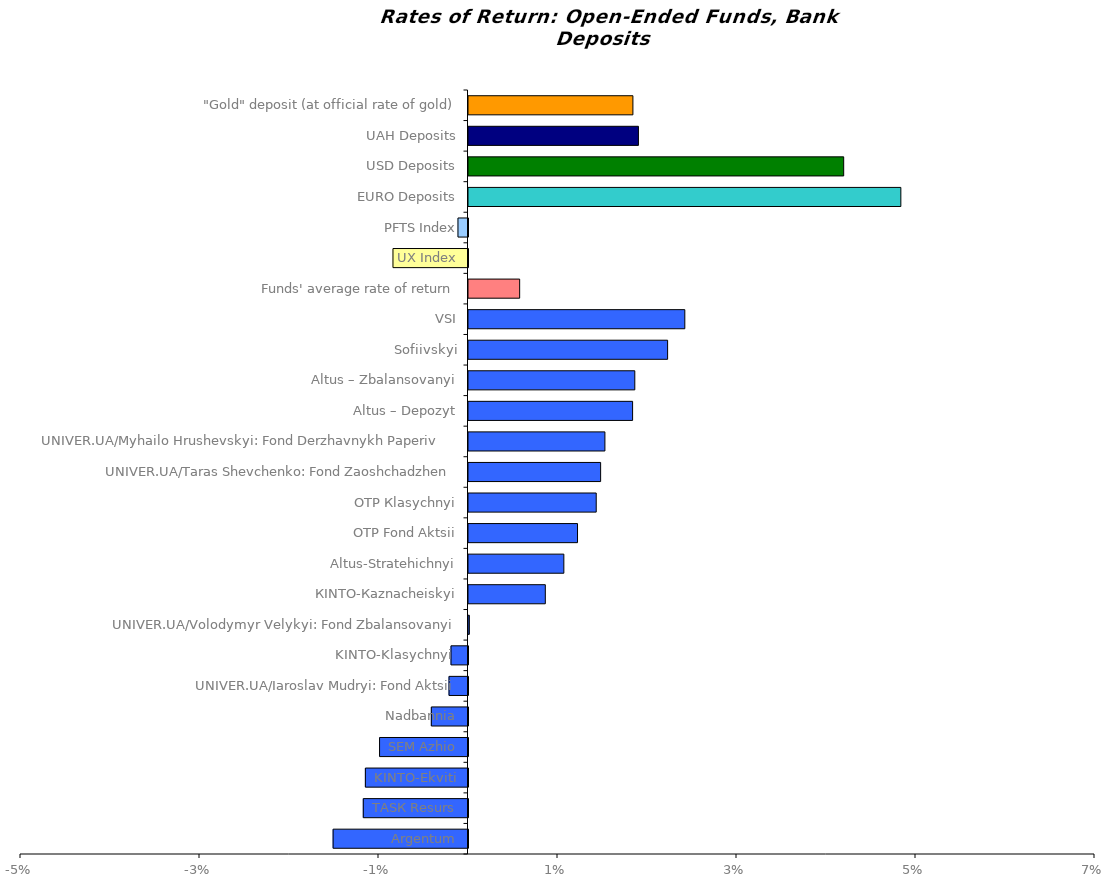
| Category | Series 0 |
|---|---|
| Аrgentum | -0.015 |
| ТАSК Resurs | -0.012 |
| KINTO-Ekviti | -0.011 |
| SEM Azhio | -0.01 |
| Nadbannia | -0.004 |
| UNIVER.UA/Iaroslav Mudryi: Fond Aktsii | -0.002 |
| KINTO-Klasychnyi  | -0.002 |
| UNIVER.UA/Volodymyr Velykyi: Fond Zbalansovanyi | 0 |
| КІNTO-Каznacheiskyi | 0.009 |
| Altus-Stratehichnyi | 0.011 |
| ОТP Fond Aktsii | 0.012 |
| ОТP Кlasychnyi | 0.014 |
| UNIVER.UA/Taras Shevchenko: Fond Zaoshchadzhen | 0.015 |
| UNIVER.UA/Myhailo Hrushevskyi: Fond Derzhavnykh Paperiv    | 0.015 |
| Altus – Depozyt | 0.018 |
| Altus – Zbalansovanyi | 0.019 |
| Sofiivskyi | 0.022 |
| VSI | 0.024 |
| Funds' average rate of return | 0.006 |
| UX Index | -0.008 |
| PFTS Index | -0.001 |
| EURO Deposits | 0.048 |
| USD Deposits | 0.042 |
| UAH Deposits | 0.019 |
| "Gold" deposit (at official rate of gold) | 0.018 |